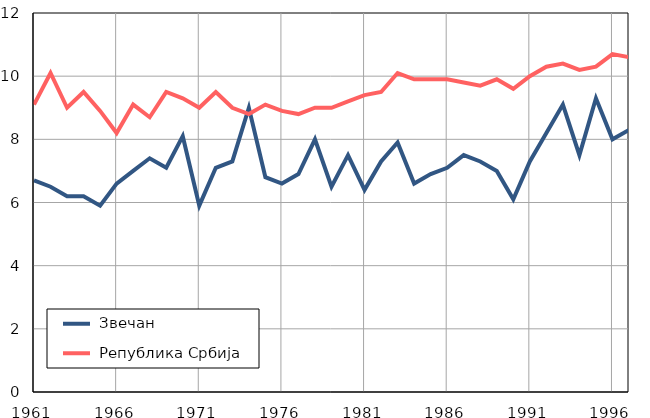
| Category |  Звечан |  Република Србија |
|---|---|---|
| 1961.0 | 6.7 | 9.1 |
| 1962.0 | 6.5 | 10.1 |
| 1963.0 | 6.2 | 9 |
| 1964.0 | 6.2 | 9.5 |
| 1965.0 | 5.9 | 8.9 |
| 1966.0 | 6.6 | 8.2 |
| 1967.0 | 7 | 9.1 |
| 1968.0 | 7.4 | 8.7 |
| 1969.0 | 7.1 | 9.5 |
| 1970.0 | 8.1 | 9.3 |
| 1971.0 | 5.9 | 9 |
| 1972.0 | 7.1 | 9.5 |
| 1973.0 | 7.3 | 9 |
| 1974.0 | 9 | 8.8 |
| 1975.0 | 6.8 | 9.1 |
| 1976.0 | 6.6 | 8.9 |
| 1977.0 | 6.9 | 8.8 |
| 1978.0 | 8 | 9 |
| 1979.0 | 6.5 | 9 |
| 1980.0 | 7.5 | 9.2 |
| 1981.0 | 6.4 | 9.4 |
| 1982.0 | 7.3 | 9.5 |
| 1983.0 | 7.9 | 10.1 |
| 1984.0 | 6.6 | 9.9 |
| 1985.0 | 6.9 | 9.9 |
| 1986.0 | 7.1 | 9.9 |
| 1987.0 | 7.5 | 9.8 |
| 1988.0 | 7.3 | 9.7 |
| 1989.0 | 7 | 9.9 |
| 1990.0 | 6.1 | 9.6 |
| 1991.0 | 7.3 | 10 |
| 1992.0 | 8.2 | 10.3 |
| 1993.0 | 9.1 | 10.4 |
| 1994.0 | 7.5 | 10.2 |
| 1995.0 | 9.3 | 10.3 |
| 1996.0 | 8 | 10.7 |
| 1997.0 | 8.3 | 10.6 |